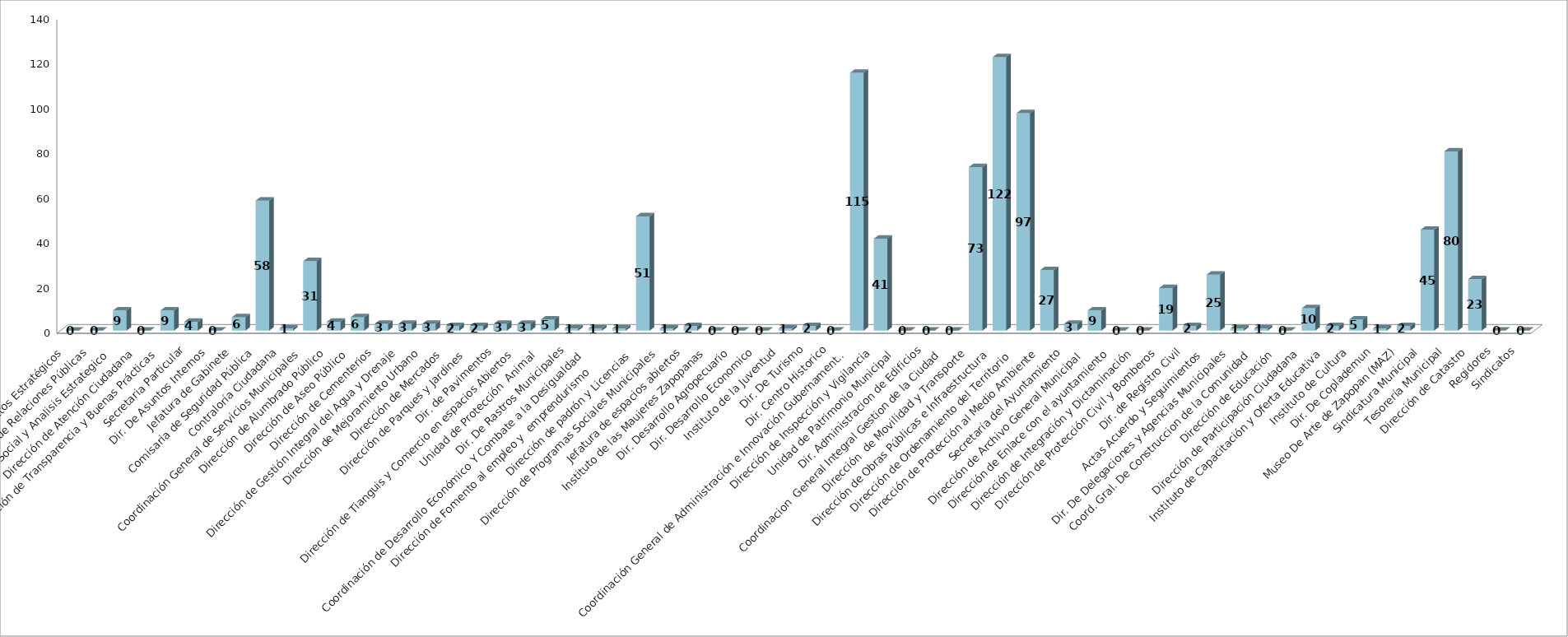
| Category | Series 0 | Series 1 |
|---|---|---|
| Area de Proyectos Estratégicos |  | 0 |
| Área de Relaciones Públicas |  | 0 |
| Comunicación Social y Analisis Estrategico  |  | 9 |
| Dirección de Atención Ciudadana |  | 0 |
| Dirección de Transparencia y Buenas Prácticas |  | 9 |
| Secretaria Particular |  | 4 |
| Dir. De Asuntos Internos |  | 0 |
| Jefatura de Gabinete |  | 6 |
| Comisaria de Seguridad Pública |  | 58 |
| Contraloría Ciudadana |  | 1 |
| Coordinación General de Servicios Municipales |  | 31 |
| Dirección de Alumbrado Público |  | 4 |
| Dirección de Aseo Público  |  | 6 |
| Dirección de Cementerios |  | 3 |
| Dirección de Gestión Integral del Agua y Drenaje |  | 3 |
| Dirección de Mejoramiento Urbano |  | 3 |
| Dirección de Mercados  |  | 2 |
| Dirección de Parques y Jardines  |  | 2 |
| Dir. de Pavimentos |  | 3 |
| Dirección de Tianguis y Comercio en espacios Abiertos |  | 3 |
| Unidad de Protección  Animal  |  | 5 |
| Dir. De Rastros Municipales |  | 1 |
| Coordinación de Desarrollo Económico Y Combate a la Desigualdad |  | 1 |
| Dirección de Fomento al empleo y  emprendurismo         |  | 1 |
| Dirección de padrón y Licencias  |  | 51 |
| Dirección de Programas Sociales Municipales |  | 1 |
| Jefatura de espacios abiertos |  | 2 |
| Instituto de las Maujeres Zapopanas |  | 0 |
|  Dir. Desarrollo Agropecuario |  | 0 |
| Dir. Desarrollo Economico |  | 0 |
| Instituto de la Juventud |  | 1 |
| Dir. De Turismo |  | 2 |
| Dir. Centro Historico |  | 0 |
| Coordinación General de Administración e Innovación Gubernamental |  | 115 |
| Dirección de Inspección y Vigilancia |  | 41 |
| Unidad de Patrimonio Municipal  |  | 0 |
| Dir. Administracion de Edificios |  | 0 |
| Coordinacion  General Integral Gestion de la Ciudad |  | 0 |
| Dirección  de Movilidad y Transporte |  | 73 |
| Dirección de Obras Públicas e Infraestructura |  | 122 |
| Dirección de Ordenamiento del Territorio  |  | 97 |
| Dirección de Protección al Medio Ambiente  |  | 27 |
| Secretaría del Ayuntamiento |  | 3 |
| Dirección de Archivo General Municipal  |  | 9 |
| Dirección de Enlace con el ayuntamiento |  | 0 |
| Dirección de Integración y Dictaminación |  | 0 |
| Dirección de Protección Civil y Bomberos |  | 19 |
| Dir. de Registro Civil |  | 2 |
| Actas Acuerdo y Seguimientos  |  | 25 |
| Dir. De Delegaciones y Agencias Municipales |  | 1 |
| Coord. Gral. De Construccion de la Comunidad |  | 1 |
| Dirección de Educación  |  | 0 |
| Dirección de Participación Ciudadana |  | 10 |
| Instituto de Capacitación y Oferta Educativa |  | 2 |
| Instituto de Cultura  |  | 5 |
| Dir. De Coplademun |  | 1 |
| Museo De Arte de Zapopan (MAZ) |  | 2 |
| Sindicatura Municipal |  | 45 |
| Tesorería Municipal |  | 80 |
| Dirección de Catastro |  | 23 |
| Regidores |  | 0 |
| Sindicatos |  | 0 |